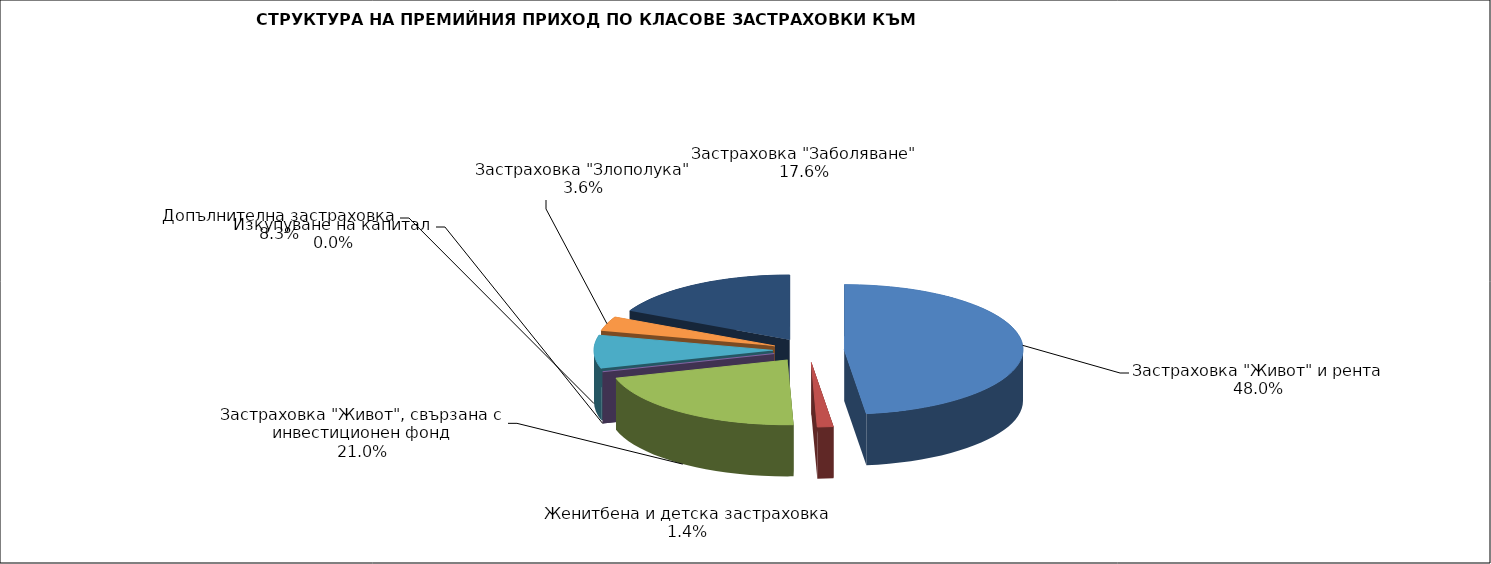
| Category | Series 0 |
|---|---|
| Застраховка "Живот" и рента | 93327909.166 |
| Женитбена и детска застраховка | 2810590.116 |
| Застраховка "Живот", свързана с инвестиционен фонд | 40810530.401 |
| Изкупуване на капитал | 0 |
| Допълнителна застраховка | 16135427.364 |
| Застраховка "Злополука" | 6985577.68 |
| Застраховка "Заболяване" | 34275474.04 |